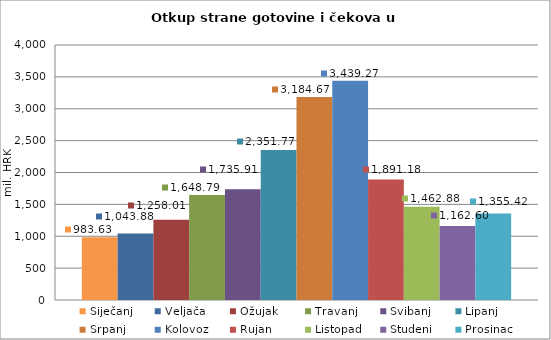
| Category | Siječanj | Veljača | Ožujak | Travanj | Svibanj | Lipanj | Srpanj | Kolovoz | Rujan | Listopad | Studeni | Prosinac |
|---|---|---|---|---|---|---|---|---|---|---|---|---|
| 0 | 983.632 | 1043.876 | 1258.009 | 1648.794 | 1735.914 | 2351.769 | 3184.671 | 3439.273 | 1891.178 | 1462.885 | 1162.6 | 1355.423 |